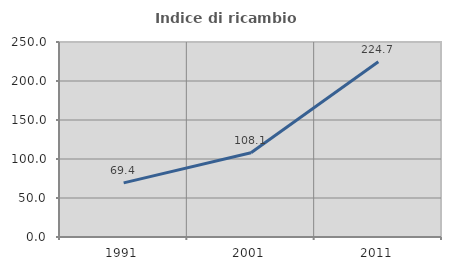
| Category | Indice di ricambio occupazionale  |
|---|---|
| 1991.0 | 69.365 |
| 2001.0 | 108.12 |
| 2011.0 | 224.703 |